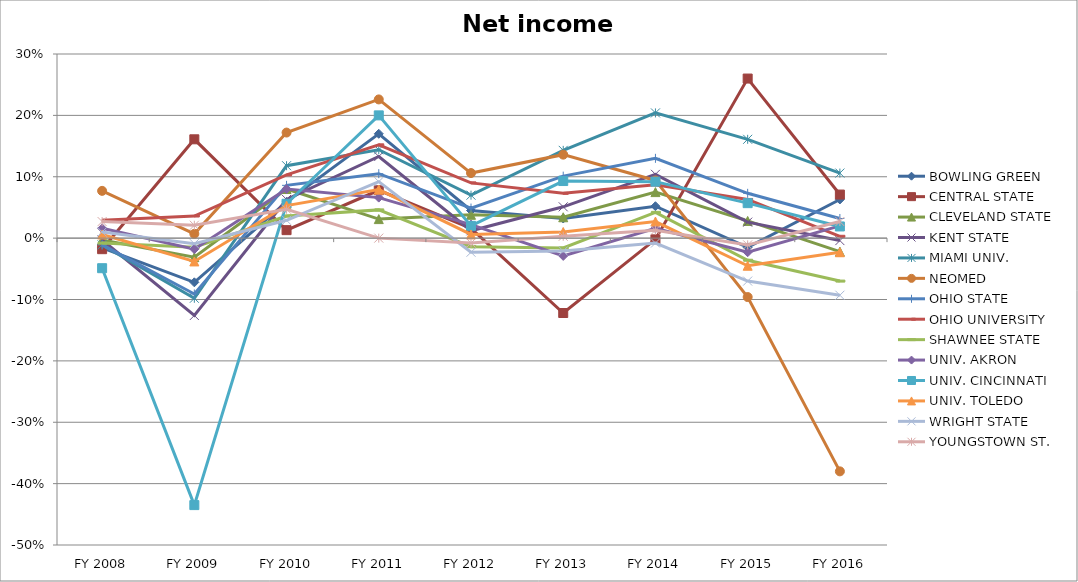
| Category | BOWLING GREEN  | CENTRAL STATE  | CLEVELAND STATE  | KENT STATE  | MIAMI UNIV.  | NEOMED  | OHIO STATE  | OHIO UNIVERSITY  | SHAWNEE STATE  | UNIV. AKRON  | UNIV. CINCINNATI  | UNIV. TOLEDO  | WRIGHT STATE  | YOUNGSTOWN ST.  |
|---|---|---|---|---|---|---|---|---|---|---|---|---|---|---|
| FY 2016 | 0.063 | 0.071 | -0.022 | -0.004 | 0.106 | -0.38 | 0.032 | 0.003 | -0.07 | 0.02 | 0.019 | -0.023 | -0.093 | 0.027 |
| FY 2015 | -0.015 | 0.26 | 0.028 | 0.026 | 0.161 | -0.096 | 0.073 | 0.063 | -0.036 | -0.023 | 0.057 | -0.045 | -0.07 | -0.011 |
| FY 2014 | 0.052 | -0.002 | 0.075 | 0.104 | 0.204 | 0.094 | 0.13 | 0.087 | 0.042 | 0.016 | 0.092 | 0.027 | -0.008 | 0.013 |
| FY 2013 | 0.032 | -0.122 | 0.034 | 0.051 | 0.143 | 0.136 | 0.101 | 0.073 | -0.016 | -0.029 | 0.093 | 0.01 | -0.021 | 0.003 |
| FY 2012 | 0.045 | 0.016 | 0.038 | 0.012 | 0.07 | 0.106 | 0.049 | 0.09 | -0.014 | 0.022 | 0.02 | 0.006 | -0.023 | -0.008 |
| FY 2011 | 0.17 | 0.078 | 0.031 | 0.133 | 0.144 | 0.226 | 0.105 | 0.152 | 0.046 | 0.066 | 0.2 | 0.079 | 0.092 | 0 |
| FY 2010 | 0.059 | 0.013 | 0.08 | 0.063 | 0.118 | 0.172 | 0.086 | 0.103 | 0.036 | 0.08 | 0.056 | 0.053 | 0.029 | 0.047 |
| FY 2009 | -0.072 | 0.161 | -0.031 | -0.126 | -0.098 | 0.007 | -0.091 | 0.036 | -0.015 | -0.018 | -0.435 | -0.038 | -0.009 | 0.021 |
| FY 2008 | -0.016 | -0.018 | -0.003 | -0.003 | -0.011 | 0.077 | -0.011 | 0.029 | -0.008 | 0.016 | -0.049 | 0.006 | 0.01 | 0.027 |